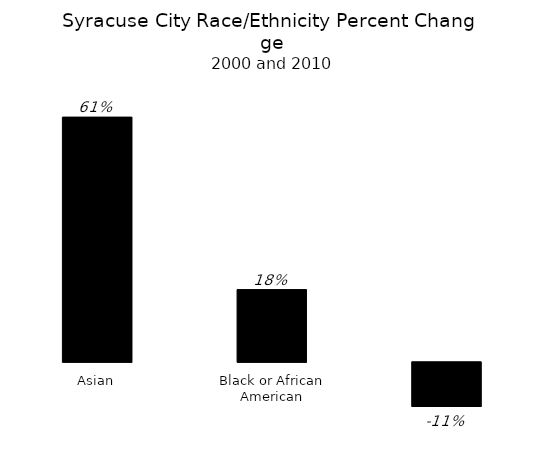
| Category | Series 0 |
|---|---|
| Asian | 0.61 |
| Black or African American | 0.18 |
| White | -0.11 |